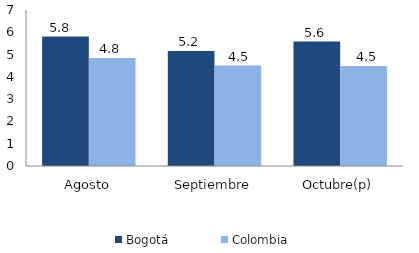
| Category | Bogotá | Colombia |
|---|---|---|
| Agosto | 5.806 | 4.846 |
| Septiembre | 5.158 | 4.505 |
| Octubre(p) | 5.581 | 4.488 |